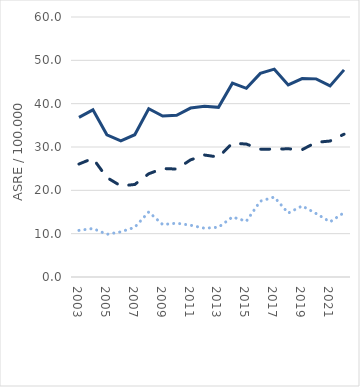
| Category | invasives MM | in situ MM | MM gesamt |
|---|---|---|---|
| 2003.0 | 26.07 | 10.759 | 36.829 |
| 2004.0 | 27.374 | 11.191 | 38.564 |
| 2005.0 | 22.953 | 9.852 | 32.806 |
| 2006.0 | 21.015 | 10.414 | 31.429 |
| 2007.0 | 21.354 | 11.478 | 32.832 |
| 2008.0 | 23.821 | 15.004 | 38.825 |
| 2009.0 | 25.031 | 12.102 | 37.133 |
| 2010.0 | 24.913 | 12.417 | 37.33 |
| 2011.0 | 27.036 | 11.947 | 38.983 |
| 2012.0 | 28.148 | 11.258 | 39.407 |
| 2013.0 | 27.672 | 11.482 | 39.154 |
| 2014.0 | 30.898 | 13.838 | 44.736 |
| 2015.0 | 30.671 | 12.871 | 43.541 |
| 2016.0 | 29.489 | 17.505 | 46.994 |
| 2017.0 | 29.515 | 18.449 | 47.963 |
| 2018.0 | 29.585 | 14.749 | 44.334 |
| 2019.0 | 29.389 | 16.404 | 45.792 |
| 2020.0 | 31.081 | 14.642 | 45.723 |
| 2021.0 | 31.376 | 12.728 | 44.104 |
| 2022.0 | 32.946 | 14.851 | 47.797 |